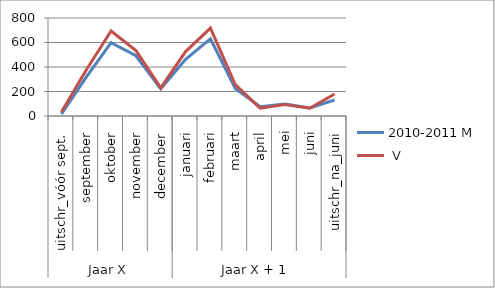
| Category | 2010-2011 |
|---|---|
| 0 | 32 |
| 1 | 375 |
| 2 | 694 |
| 3 | 534 |
| 4 | 230 |
| 5 | 526 |
| 6 | 718 |
| 7 | 257 |
| 8 | 64 |
| 9 | 94 |
| 10 | 63 |
| 11 | 179 |